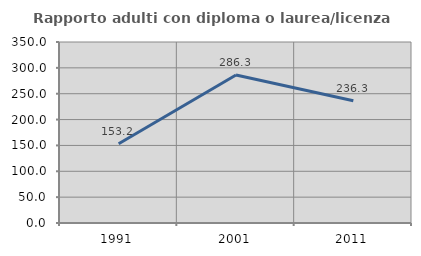
| Category | Rapporto adulti con diploma o laurea/licenza media  |
|---|---|
| 1991.0 | 153.247 |
| 2001.0 | 286.301 |
| 2011.0 | 236.264 |